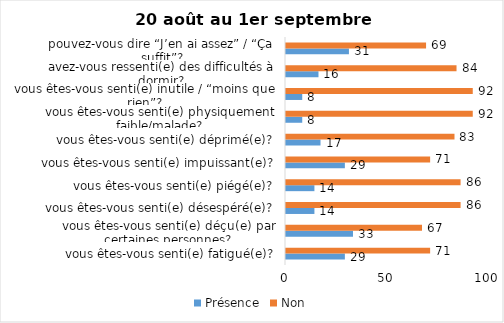
| Category | Présence | Non |
|---|---|---|
| vous êtes-vous senti(e) fatigué(e)? | 29 | 71 |
| vous êtes-vous senti(e) déçu(e) par certaines personnes? | 33 | 67 |
| vous êtes-vous senti(e) désespéré(e)? | 14 | 86 |
| vous êtes-vous senti(e) piégé(e)? | 14 | 86 |
| vous êtes-vous senti(e) impuissant(e)? | 29 | 71 |
| vous êtes-vous senti(e) déprimé(e)? | 17 | 83 |
| vous êtes-vous senti(e) physiquement faible/malade? | 8 | 92 |
| vous êtes-vous senti(e) inutile / “moins que rien”? | 8 | 92 |
| avez-vous ressenti(e) des difficultés à dormir? | 16 | 84 |
| pouvez-vous dire “J’en ai assez” / “Ça suffit”? | 31 | 69 |